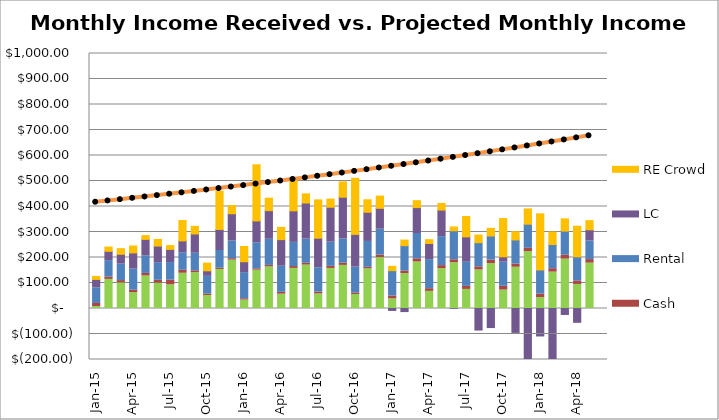
| Category | Dividends |  Cash  |  Rental  |  LC  |  RE Crowd  |
|---|---|---|---|---|---|
| 2015-01-01 | 7.571 | 12.19 | 61.503 | 32.77 | 11.817 |
| 2015-02-01 | 114.22 | 9.025 | 64.554 | 36.326 | 16.888 |
| 2015-03-01 | 100.49 | 8.985 | 64.554 | 38.591 | 21.959 |
| 2015-04-01 | 62.089 | 9.766 | 82.516 | 63.617 | 27.03 |
| 2015-05-01 | 127.688 | 9.887 | 69.114 | 64.198 | 15 |
| 2015-06-01 | 99.44 | 11.197 | 69.114 | 65.077 | 26 |
| 2015-07-01 | 93.025 | 18.056 | 69.114 | 51.55 | 15 |
| 2015-08-01 | 138.207 | 11.564 | 69.114 | 46.237 | 80 |
| 2015-09-01 | 140.656 | 6.945 | 69.114 | 75.574 | 30 |
| 2015-10-01 | 50.806 | 6.193 | 69.114 | 21.772 | 30 |
| 2015-11-01 | 153.093 | 5.234 | 69.114 | 82.519 | 150 |
| 2015-12-01 | 189.685 | 5.762 | 69.114 | 106.984 | 32 |
| 2016-01-01 | 33.105 | 5.268 | 102.349 | 42.662 | 60 |
| 2016-02-01 | 150.269 | 5.285 | 102.349 | 85.617 | 220 |
| 2016-03-01 | 163.329 | 5.791 | 102.349 | 112.247 | 49 |
| 2016-04-01 | 56.217 | 7.215 | 102.349 | 104.372 | 48 |
| 2016-05-01 | 157.285 | 7.238 | 94.883 | 123.47 | 120 |
| 2016-06-01 | 170.374 | 6.928 | 94.883 | 141.555 | 35.87 |
| 2016-07-01 | 57.255 | 7.417 | 94.883 | 116.309 | 150 |
| 2016-08-01 | 157.144 | 8.158 | 94.883 | 136.846 | 32 |
| 2016-09-01 | 169.12 | 8.64 | 94.883 | 163.801 | 60 |
| 2016-10-01 | 54.825 | 6.021 | 101.451 | 128.337 | 220 |
| 2016-11-01 | 155.528 | 6.061 | 101.451 | 114.357 | 49 |
| 2016-12-01 | 199.686 | 9.755 | 101.451 | 81.936 | 48 |
| 2017-01-01 | 37.639 | 11.386 | 99.342 | -11.529 | 16.888 |
| 2017-02-01 | 136.731 | 10.312 | 99.342 | -16.036 | 21.959 |
| 2017-03-01 | 182.623 | 12.19 | 99.342 | 101.5 | 27.03 |
| 2017-04-01 | 67.244 | 10.473 | 113.841 | 63.376 | 15 |
| 2017-05-01 | 156.442 | 11.719 | 113.715 | 104.035 | 26 |
| 2017-06-01 | 179.538 | 11.513 | 113.715 | -3 | 15 |
| 2017-07-01 | 74.87 | 11.875 | 94.626 | 99.568 | 80 |
| 2017-08-01 | 151.12 | 12.294 | 94.626 | -88.44 | 30 |
| 2017-09-01 | 176.171 | 13.483 | 94.626 | -78.633 | 30 |
| 2017-10-01 | 72.489 | 14.575 | 94.626 | 20.976 | 150 |
| 2017-11-01 | 161.762 | 12.489 | 94.626 | -97.64 | 32 |
| 2017-12-01 | 223.083 | 12.897 | 94.626 | -253.447 | 60 |
| 2018-01-01 | 42.645 | 13.931 | 94.626 | -111.642 | 220 |
| 2018-02-01 | 142.761 | 13.374 | 94.626 | -209.994 | 49 |
| 2018-03-01 | 193.642 | 15.247 | 94.626 | -27.313 | 48 |
| 2018-04-01 | 94.354 | 13.69 | 94.626 | -58.069 | 120 |
| 2018-05-01 | 177.867 | 13.908 | 73.392 | 43.522 | 35.87 |